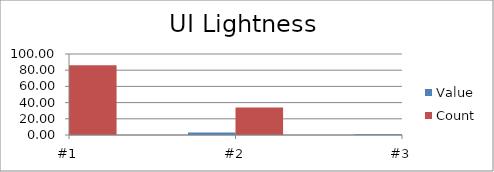
| Category | Value | Count |
|---|---|---|
| #1 | 5 | 86 |
| #2 | 3 | 34 |
| #3 | 1 | 33 |